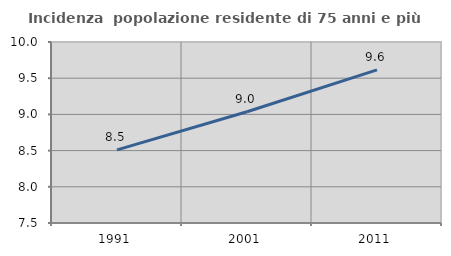
| Category | Incidenza  popolazione residente di 75 anni e più |
|---|---|
| 1991.0 | 8.509 |
| 2001.0 | 9.037 |
| 2011.0 | 9.616 |